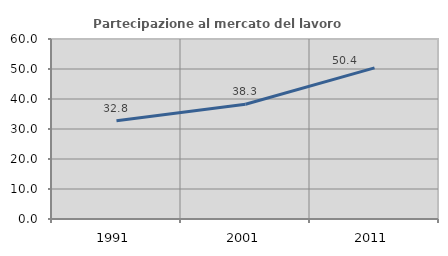
| Category | Partecipazione al mercato del lavoro  femminile |
|---|---|
| 1991.0 | 32.78 |
| 2001.0 | 38.26 |
| 2011.0 | 50.391 |